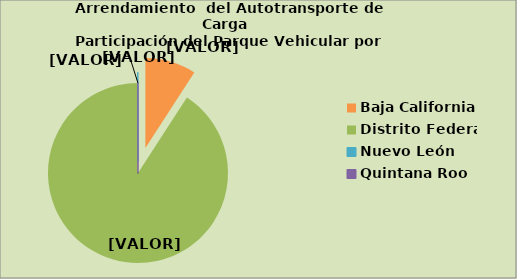
| Category | Series 0 |
|---|---|
| Baja California | 9.144 |
| Distrito Federal | 90.814 |
| Nuevo León | 0.023 |
| Quintana Roo | 0.018 |